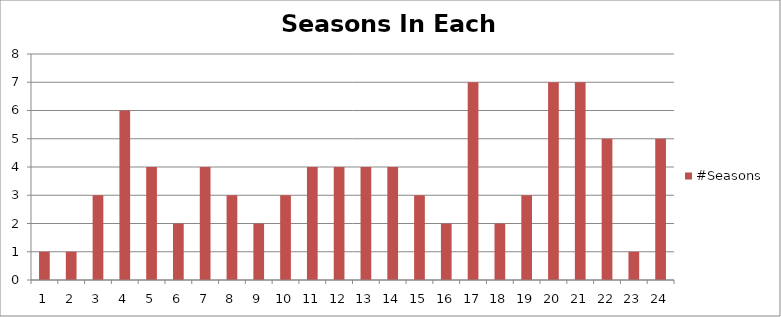
| Category | #Seasons |
|---|---|
| 0 | 1 |
| 1 | 1 |
| 2 | 3 |
| 3 | 6 |
| 4 | 4 |
| 5 | 2 |
| 6 | 4 |
| 7 | 3 |
| 8 | 2 |
| 9 | 3 |
| 10 | 4 |
| 11 | 4 |
| 12 | 4 |
| 13 | 4 |
| 14 | 3 |
| 15 | 2 |
| 16 | 7 |
| 17 | 2 |
| 18 | 3 |
| 19 | 7 |
| 20 | 7 |
| 21 | 5 |
| 22 | 1 |
| 23 | 5 |